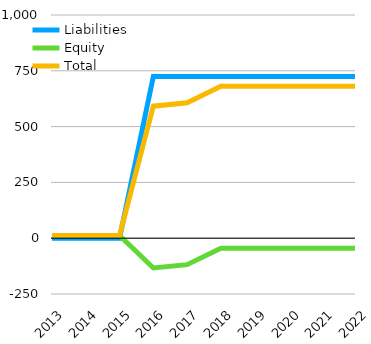
| Category | Liabilities  | Equity  | Total |
|---|---|---|---|
| 2013 | 0 | 12.5 | 12.5 |
| 2014 | 0 | 12.5 | 12.5 |
| 2015 | 0 | 12.5 | 12.5 |
| 2016 | 725 | -133.5 | 591.5 |
| 2017 | 725 | -118.5 | 606.5 |
| 2018 | 725 | -44.5 | 680.5 |
| 2019 | 725 | -44.5 | 680.5 |
| 2020 | 725 | -44.5 | 680.5 |
| 2021 | 725 | -44.5 | 680.5 |
| 2022 | 725 | -44.5 | 680.5 |